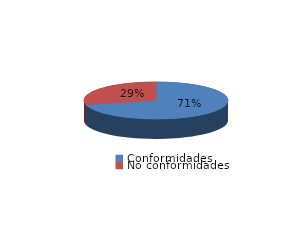
| Category | Series 0 |
|---|---|
| Conformidades | 5430 |
| No conformidades | 2224 |